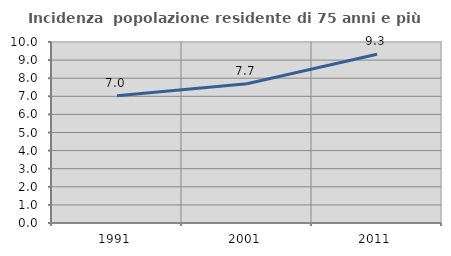
| Category | Incidenza  popolazione residente di 75 anni e più |
|---|---|
| 1991.0 | 7.034 |
| 2001.0 | 7.692 |
| 2011.0 | 9.319 |